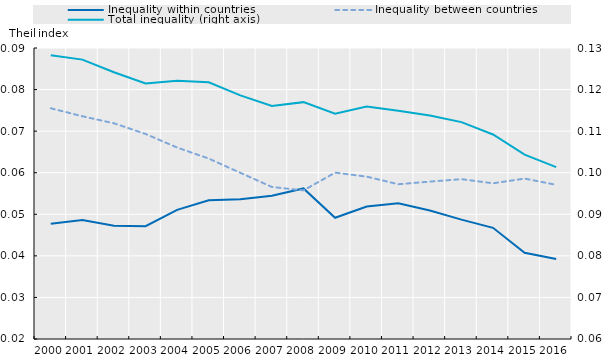
| Category | Inequality within countries | Inequality between countries |
|---|---|---|
| 2000.0 | 0.048 | 0.076 |
| 2001.0 | 0.049 | 0.074 |
| 2002.0 | 0.047 | 0.072 |
| 2003.0 | 0.047 | 0.069 |
| 2004.0 | 0.051 | 0.066 |
| 2005.0 | 0.053 | 0.063 |
| 2006.0 | 0.054 | 0.06 |
| 2007.0 | 0.054 | 0.057 |
| 2008.0 | 0.056 | 0.056 |
| 2009.0 | 0.049 | 0.06 |
| 2010.0 | 0.052 | 0.059 |
| 2011.0 | 0.053 | 0.057 |
| 2012.0 | 0.051 | 0.058 |
| 2013.0 | 0.049 | 0.058 |
| 2014.0 | 0.047 | 0.057 |
| 2015.0 | 0.041 | 0.059 |
| 2016.0 | 0.039 | 0.057 |